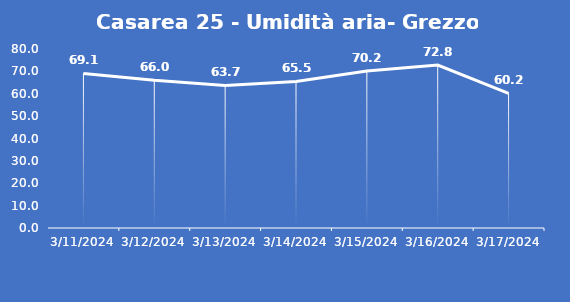
| Category | Casarea 25 - Umidità aria- Grezzo (%) |
|---|---|
| 3/11/24 | 69.1 |
| 3/12/24 | 66 |
| 3/13/24 | 63.7 |
| 3/14/24 | 65.5 |
| 3/15/24 | 70.2 |
| 3/16/24 | 72.8 |
| 3/17/24 | 60.2 |